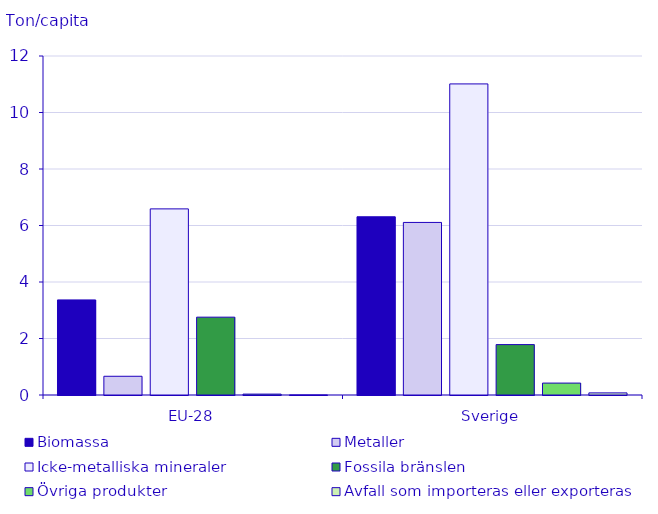
| Category | Biomassa | Metaller | Icke-metalliska mineraler | Fossila bränslen | Övriga produkter | Avfall som importeras eller exporteras |
|---|---|---|---|---|---|---|
| EU-28 | 3.366 | 0.663 | 6.588 | 2.755 | 0.032 | 0.002 |
| Sverige | 6.309 | 6.109 | 11.012 | 1.784 | 0.422 | 0.075 |